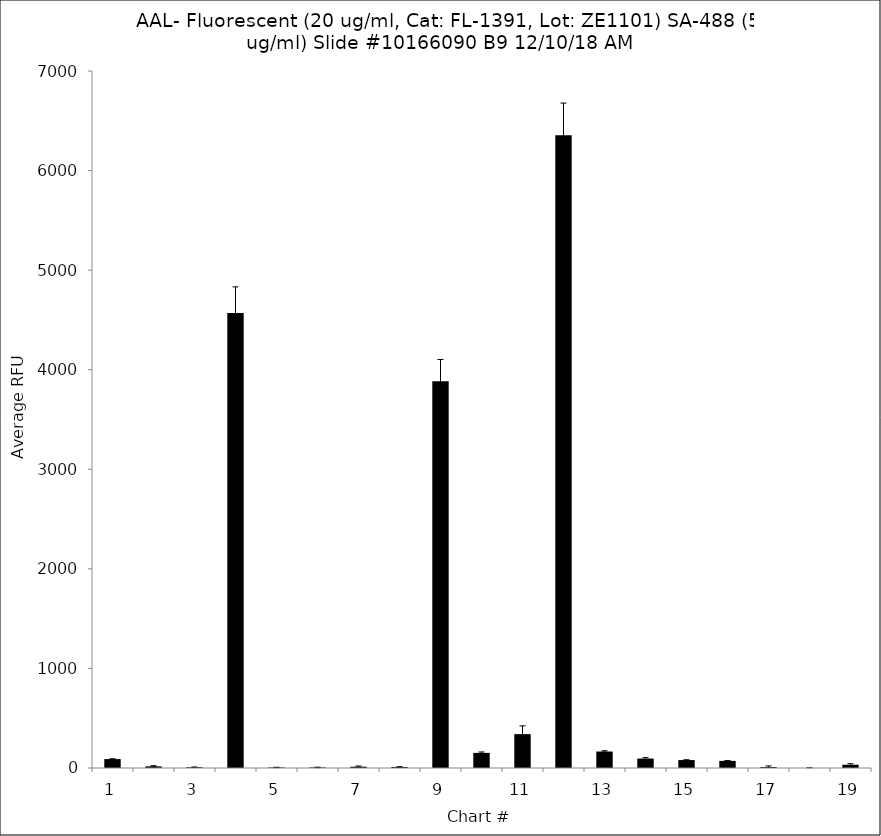
| Category | Series 0 |
|---|---|
| 1.0 | 89.5 |
| 2.0 | 16.5 |
| 3.0 | 7.75 |
| 4.0 | 4568.5 |
| 5.0 | 5.25 |
| 6.0 | 5.75 |
| 7.0 | 13 |
| 8.0 | 10.25 |
| 9.0 | 3883 |
| 10.0 | 151.75 |
| 11.0 | 340.25 |
| 12.0 | 6355.5 |
| 13.0 | 165.5 |
| 14.0 | 94.75 |
| 15.0 | 79.75 |
| 16.0 | 71.5 |
| 17.0 | 9.75 |
| 18.0 | 0.25 |
| 19.0 | 32.5 |